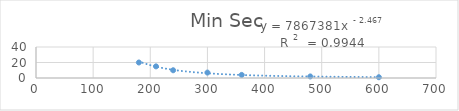
| Category | Min Sec |
|---|---|
| 180.0 | 20 |
| 210.0 | 15 |
| 240.0 | 10 |
| 300.0 | 7 |
| 360.0 | 4 |
| 480.0 | 2 |
| 600.0 | 1 |